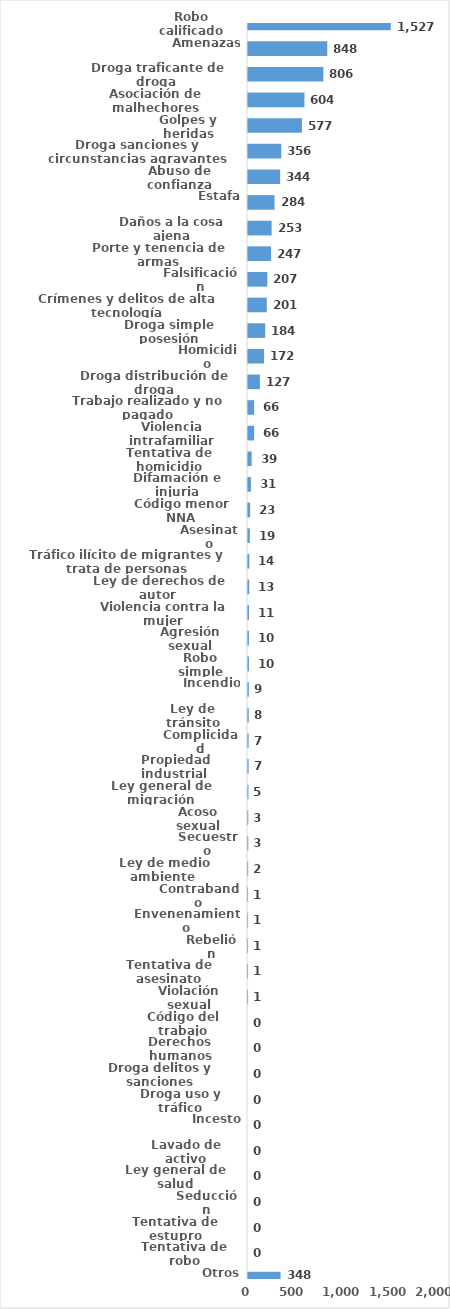
| Category | Series 0 |
|---|---|
| Robo calificado | 1527 |
| Amenazas | 848 |
| Droga traficante de droga  | 806 |
| Asociación de malhechores | 604 |
| Golpes y heridas | 577 |
| Droga sanciones y circunstancias agravantes | 356 |
| Abuso de confianza | 344 |
| Estafa | 284 |
| Daños a la cosa ajena | 253 |
| Porte y tenencia de armas | 247 |
| Falsificación | 207 |
| Crímenes y delitos de alta tecnología | 201 |
| Droga simple posesión | 184 |
| Homicidio | 172 |
| Droga distribución de droga | 127 |
| Trabajo realizado y no pagado | 66 |
| Violencia intrafamiliar | 66 |
| Tentativa de homicidio | 39 |
| Difamación e injuria | 31 |
| Código menor NNA | 23 |
| Asesinato | 19 |
| Tráfico ilícito de migrantes y trata de personas | 14 |
| Ley de derechos de autor  | 13 |
| Violencia contra la mujer | 11 |
| Agresión sexual | 10 |
| Robo simple | 10 |
| Incendio | 9 |
| Ley de tránsito | 8 |
| Complicidad | 7 |
| Propiedad industrial  | 7 |
| Ley general de migración | 5 |
| Acoso sexual | 3 |
| Secuestro | 3 |
| Ley de medio ambiente  | 2 |
| Contrabando | 1 |
| Envenenamiento | 1 |
| Rebelión | 1 |
| Tentativa de asesinato | 1 |
| Violación sexual | 1 |
| Código del trabajo | 0 |
| Derechos humanos | 0 |
| Droga delitos y sanciones | 0 |
| Droga uso y tráfico | 0 |
| Incesto | 0 |
| Lavado de activo | 0 |
| Ley general de salud | 0 |
| Seducción | 0 |
| Tentativa de estupro | 0 |
| Tentativa de robo | 0 |
| Otros | 348 |